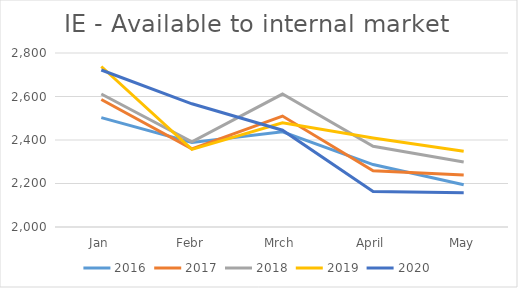
| Category | 2016 | 2017 | 2018 | 2019 | 2020 |
|---|---|---|---|---|---|
| Jan | 2503 | 2586.093 | 2611.56 | 2737.968 | 2721.933 |
| Febr | 2389 | 2359.048 | 2391.66 | 2356.694 | 2566.504 |
| Mrch | 2438 | 2510.063 | 2611.178 | 2478.817 | 2445.003 |
| April | 2287 | 2258.38 | 2371.122 | 2408.793 | 2162.945 |
| May | 2194 | 2239.168 | 2298.828 | 2348.17 | 2157.642 |